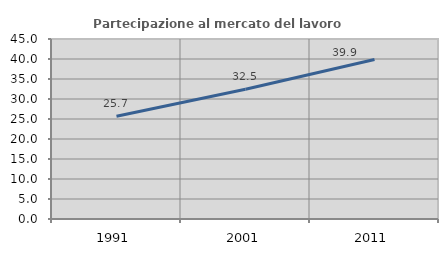
| Category | Partecipazione al mercato del lavoro  femminile |
|---|---|
| 1991.0 | 25.672 |
| 2001.0 | 32.456 |
| 2011.0 | 39.879 |